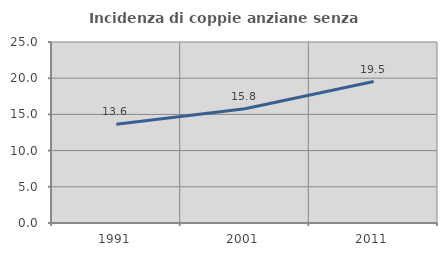
| Category | Incidenza di coppie anziane senza figli  |
|---|---|
| 1991.0 | 13.631 |
| 2001.0 | 15.789 |
| 2011.0 | 19.542 |